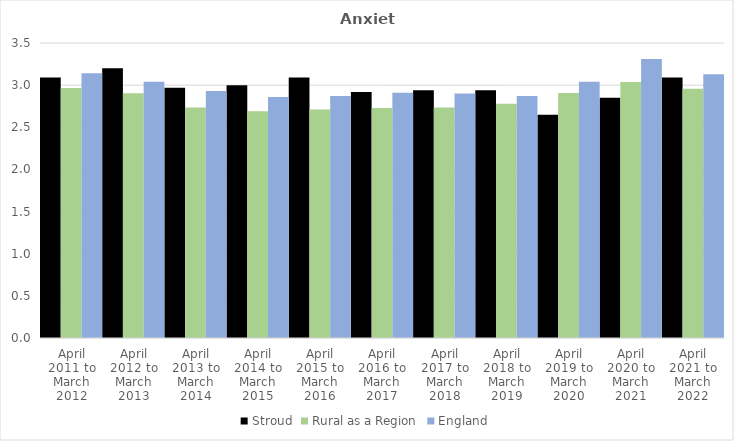
| Category | Stroud | Rural as a Region | England |
|---|---|---|---|
| April 2011 to March 2012 | 3.09 | 2.967 | 3.14 |
| April 2012 to March 2013 | 3.2 | 2.904 | 3.04 |
| April 2013 to March 2014 | 2.97 | 2.734 | 2.93 |
| April 2014 to March 2015 | 3 | 2.691 | 2.86 |
| April 2015 to March 2016 | 3.09 | 2.711 | 2.87 |
| April 2016 to March 2017 | 2.92 | 2.729 | 2.91 |
| April 2017 to March 2018 | 2.94 | 2.736 | 2.9 |
| April 2018 to March 2019 | 2.94 | 2.78 | 2.87 |
| April 2019 to March 2020 | 2.65 | 2.908 | 3.04 |
| April 2020 to March 2021 | 2.85 | 3.036 | 3.31 |
| April 2021 to March 2022 | 3.09 | 2.956 | 3.13 |